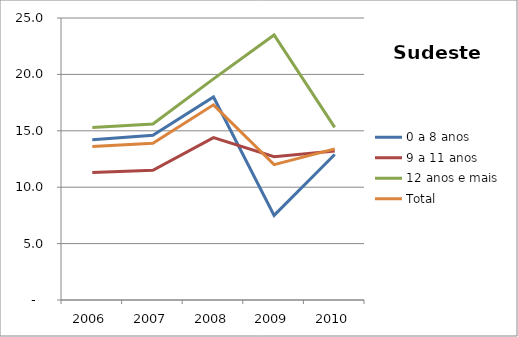
| Category | 0 a 8 anos | 9 a 11 anos | 12 anos e mais | Total |
|---|---|---|---|---|
| 2006.0 | 14.2 | 11.3 | 15.3 | 13.6 |
| 2007.0 | 14.6 | 11.5 | 15.6 | 13.9 |
| 2008.0 | 18 | 14.4 | 19.6 | 17.3 |
| 2009.0 | 7.5 | 12.7 | 23.5 | 12 |
| 2010.0 | 12.9 | 13.2 | 15.3 | 13.4 |